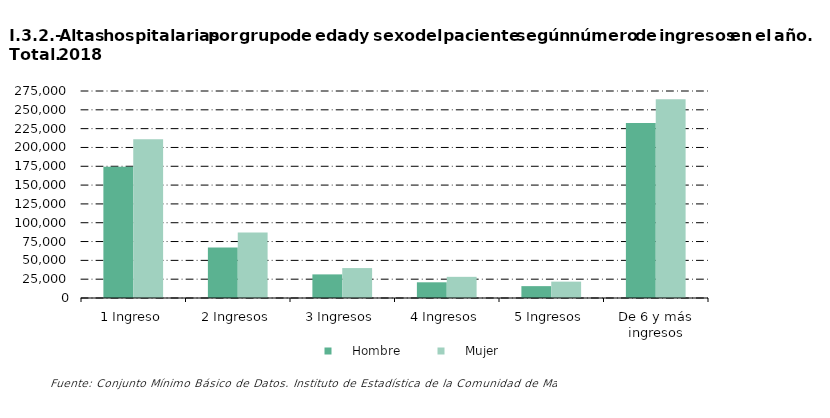
| Category |     Hombre |     Mujer |
|---|---|---|
| 1 Ingreso | 174334 | 210781 |
| 2 Ingresos | 66982 | 87039 |
| 3 Ingresos | 31367 | 39772 |
| 4 Ingresos | 20857 | 28123 |
| 5 Ingresos | 15761 | 21738 |
| De 6 y más ingresos | 232600 | 264185 |